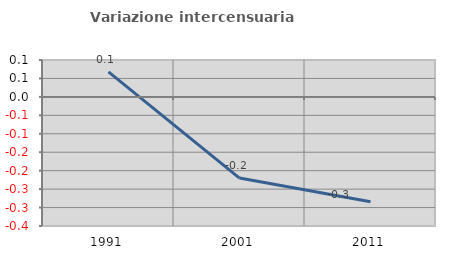
| Category | Variazione intercensuaria annua |
|---|---|
| 1991.0 | 0.068 |
| 2001.0 | -0.22 |
| 2011.0 | -0.284 |